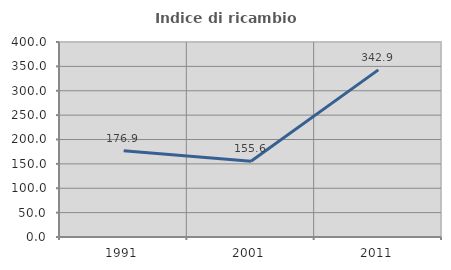
| Category | Indice di ricambio occupazionale  |
|---|---|
| 1991.0 | 176.923 |
| 2001.0 | 155.556 |
| 2011.0 | 342.857 |